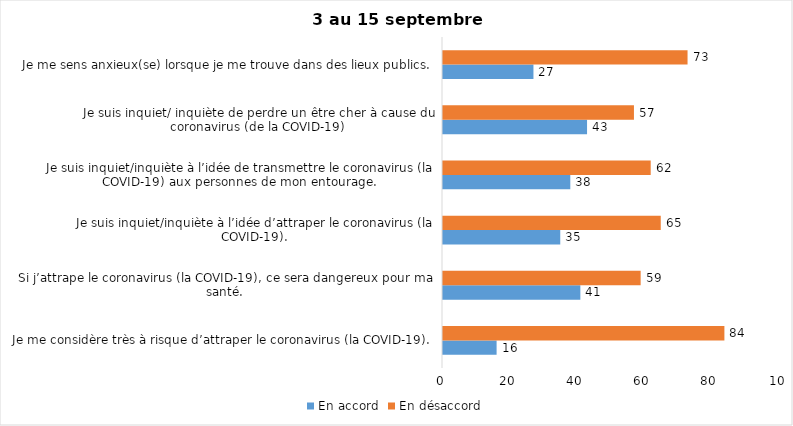
| Category | En accord | En désaccord |
|---|---|---|
| Je me considère très à risque d’attraper le coronavirus (la COVID-19). | 16 | 84 |
| Si j’attrape le coronavirus (la COVID-19), ce sera dangereux pour ma santé. | 41 | 59 |
| Je suis inquiet/inquiète à l’idée d’attraper le coronavirus (la COVID-19). | 35 | 65 |
| Je suis inquiet/inquiète à l’idée de transmettre le coronavirus (la COVID-19) aux personnes de mon entourage. | 38 | 62 |
| Je suis inquiet/ inquiète de perdre un être cher à cause du coronavirus (de la COVID-19) | 43 | 57 |
| Je me sens anxieux(se) lorsque je me trouve dans des lieux publics. | 27 | 73 |